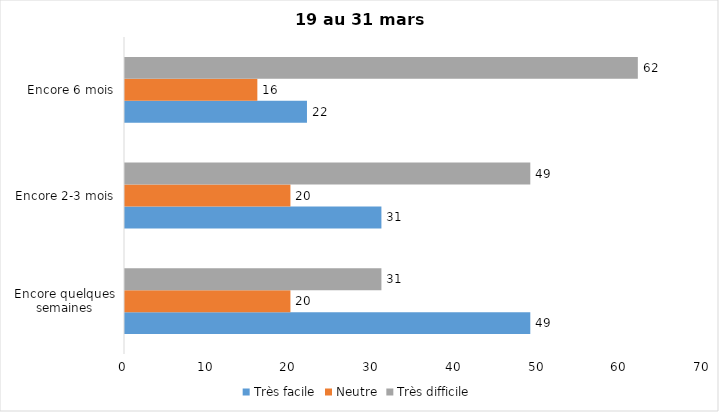
| Category | Très facile | Neutre | Très difficile |
|---|---|---|---|
| Encore quelques semaines | 49 | 20 | 31 |
| Encore 2-3 mois | 31 | 20 | 49 |
| Encore 6 mois | 22 | 16 | 62 |